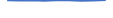
| Category | Series 0 |
|---|---|
| 0 | 92 |
| 1 | 77 |
| 2 | 86 |
| 3 | 66 |
| 4 | 88 |
| 5 | 91 |
| 6 | 62 |
| 7 | 69 |
| 8 | 94 |